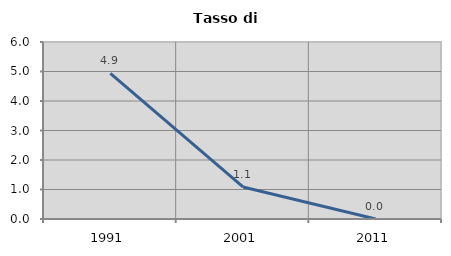
| Category | Tasso di disoccupazione   |
|---|---|
| 1991.0 | 4.938 |
| 2001.0 | 1.087 |
| 2011.0 | 0 |